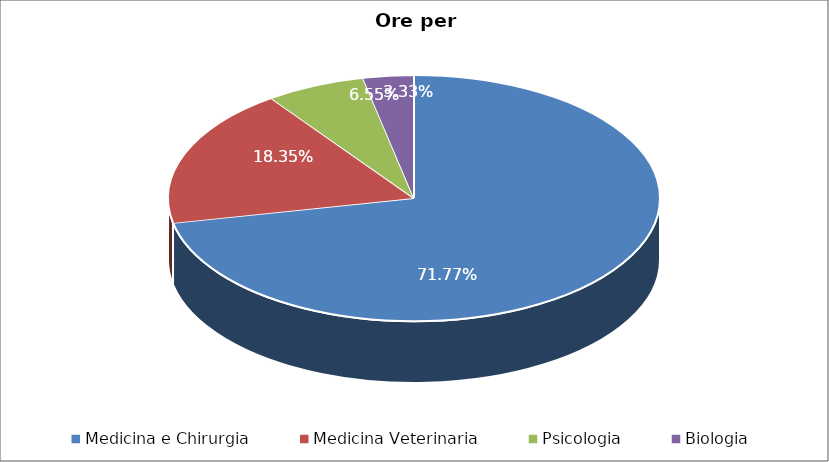
| Category | Series 0 |
|---|---|
| Medicina e Chirurgia | 3879 |
| Medicina Veterinaria | 991.5 |
| Psicologia | 354 |
| Biologia | 180 |